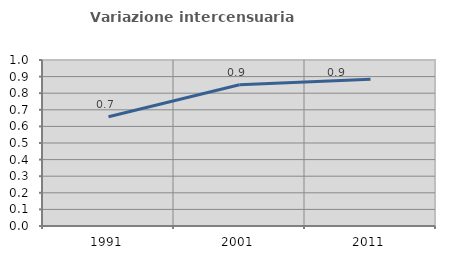
| Category | Variazione intercensuaria annua |
|---|---|
| 1991.0 | 0.658 |
| 2001.0 | 0.851 |
| 2011.0 | 0.884 |